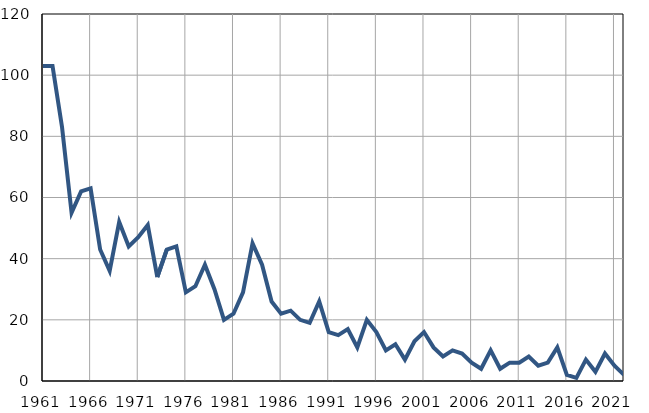
| Category | Infants
deaths |
|---|---|
| 1961.0 | 103 |
| 1962.0 | 103 |
| 1963.0 | 83 |
| 1964.0 | 55 |
| 1965.0 | 62 |
| 1966.0 | 63 |
| 1967.0 | 43 |
| 1968.0 | 36 |
| 1969.0 | 52 |
| 1970.0 | 44 |
| 1971.0 | 47 |
| 1972.0 | 51 |
| 1973.0 | 34 |
| 1974.0 | 43 |
| 1975.0 | 44 |
| 1976.0 | 29 |
| 1977.0 | 31 |
| 1978.0 | 38 |
| 1979.0 | 30 |
| 1980.0 | 20 |
| 1981.0 | 22 |
| 1982.0 | 29 |
| 1983.0 | 45 |
| 1984.0 | 38 |
| 1985.0 | 26 |
| 1986.0 | 22 |
| 1987.0 | 23 |
| 1988.0 | 20 |
| 1989.0 | 19 |
| 1990.0 | 26 |
| 1991.0 | 16 |
| 1992.0 | 15 |
| 1993.0 | 17 |
| 1994.0 | 11 |
| 1995.0 | 20 |
| 1996.0 | 16 |
| 1997.0 | 10 |
| 1998.0 | 12 |
| 1999.0 | 7 |
| 2000.0 | 13 |
| 2001.0 | 16 |
| 2002.0 | 11 |
| 2003.0 | 8 |
| 2004.0 | 10 |
| 2005.0 | 9 |
| 2006.0 | 6 |
| 2007.0 | 4 |
| 2008.0 | 10 |
| 2009.0 | 4 |
| 2010.0 | 6 |
| 2011.0 | 6 |
| 2012.0 | 8 |
| 2013.0 | 5 |
| 2014.0 | 6 |
| 2015.0 | 11 |
| 2016.0 | 2 |
| 2017.0 | 1 |
| 2018.0 | 7 |
| 2019.0 | 3 |
| 2020.0 | 9 |
| 2021.0 | 5 |
| 2022.0 | 2 |